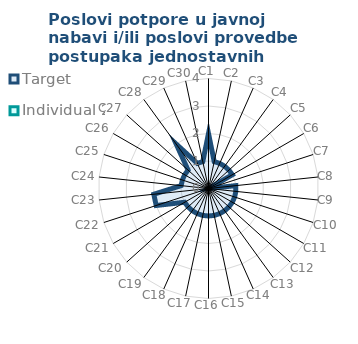
| Category | Target | Individual 2 |
|---|---|---|
| C1 | 2 | 0 |
| C2 | 1 | 0 |
| C3 | 1 | 0 |
| C4 | 1 | 0 |
| C5 | 1 | 0 |
| C6 | 1 | 0 |
| C7 | 0 | 0 |
| C8 | 1 | 0 |
| C9 | 1 | 0 |
| C10 | 1 | 0 |
| C11 | 1 | 0 |
| C12 | 1 | 0 |
| C13 | 1 | 0 |
| C14 | 1 | 0 |
| C15 | 1 | 0 |
| C16 | 1 | 0 |
| C17 | 1 | 0 |
| C18 | 1 | 0 |
| C19 | 1 | 0 |
| C20 | 1 | 0 |
| C21 | 1 | 0 |
| C22 | 2 | 0 |
| C23 | 2 | 0 |
| C24 | 1 | 0 |
| C25 | 1 | 0 |
| C26 | 1 | 0 |
| C27 | 1 | 0 |
| C28 | 2 | 0 |
| C29 | 1 | 0 |
| C30 | 1 | 0 |